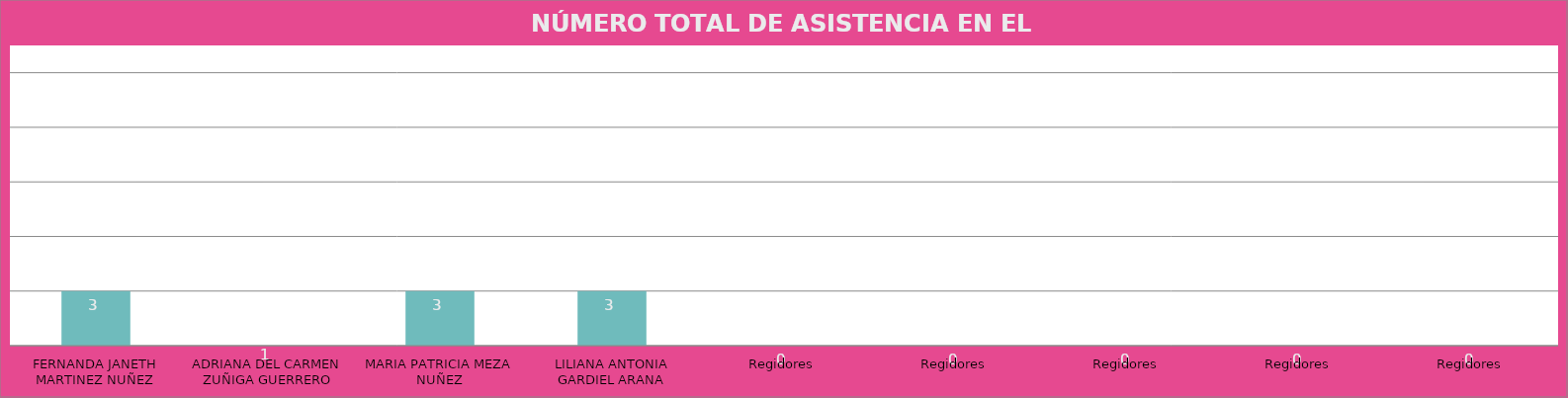
| Category | FERNANDA JANETH MARTINEZ NUÑEZ |
|---|---|
| FERNANDA JANETH MARTINEZ NUÑEZ | 3 |
| ADRIANA DEL CARMEN ZUÑIGA GUERRERO | 1 |
| MARIA PATRICIA MEZA NUÑEZ | 3 |
| LILIANA ANTONIA GARDIEL ARANA | 3 |
| Regidores | 0 |
| Regidores | 0 |
| Regidores | 0 |
| Regidores | 0 |
| Regidores | 0 |